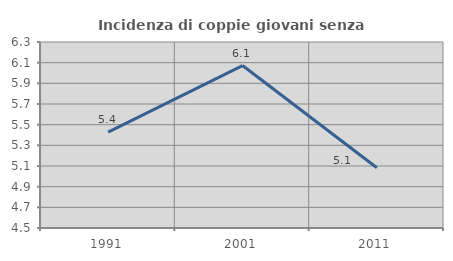
| Category | Incidenza di coppie giovani senza figli |
|---|---|
| 1991.0 | 5.428 |
| 2001.0 | 6.072 |
| 2011.0 | 5.084 |